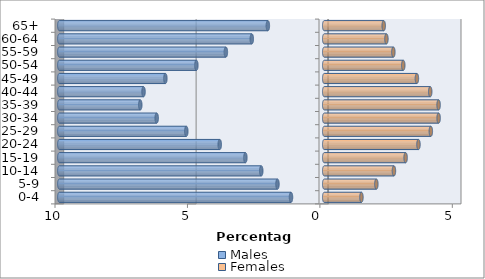
| Category | Males | Females |
|---|---|---|
| 0-4 | -1.254 | 1.405 |
| 5-9 | -1.765 | 1.968 |
| 10-14 | -2.377 | 2.632 |
| 15-19 | -2.977 | 3.073 |
| 20-24 | -3.944 | 3.558 |
| 25-29 | -5.207 | 4.025 |
| 30-34 | -6.325 | 4.319 |
| 35-39 | -6.944 | 4.318 |
| 40-44 | -6.822 | 4.002 |
| 45-49 | -5.997 | 3.499 |
| 50-54 | -4.827 | 2.984 |
| 55-59 | -3.713 | 2.61 |
| 60-64 | -2.735 | 2.348 |
| 65+ | -2.128 | 2.246 |